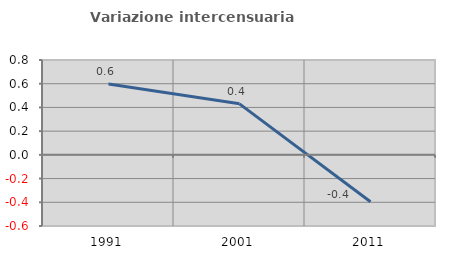
| Category | Variazione intercensuaria annua |
|---|---|
| 1991.0 | 0.597 |
| 2001.0 | 0.43 |
| 2011.0 | -0.395 |